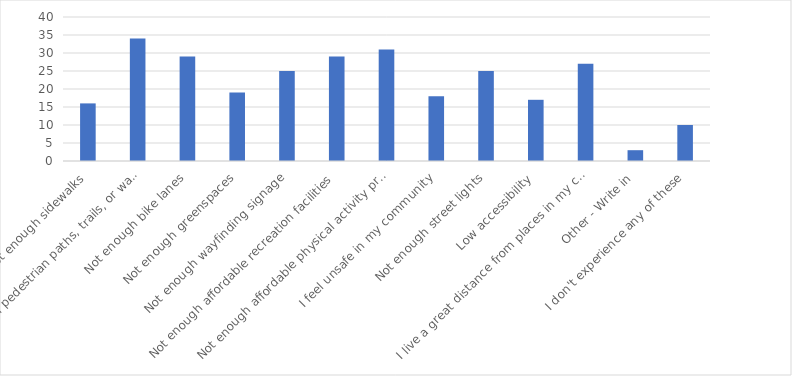
| Category | Number of Responses |
|---|---|
| Not enough sidewalks | 16 |
| Not enough pedestrian paths, trails, or walkways | 34 |
| Not enough bike lanes | 29 |
| Not enough greenspaces | 19 |
| Not enough wayfinding signage | 25 |
| Not enough affordable recreation facilities | 29 |
| Not enough affordable physical activity programs | 31 |
| I feel unsafe in my community | 18 |
| Not enough street lights | 25 |
| Low accessibility | 17 |
| I live a great distance from places in my community | 27 |
| Other - Write in | 3 |
| I don't experience any of these | 10 |